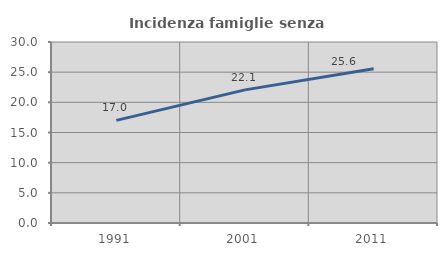
| Category | Incidenza famiglie senza nuclei |
|---|---|
| 1991.0 | 17.011 |
| 2001.0 | 22.067 |
| 2011.0 | 25.576 |